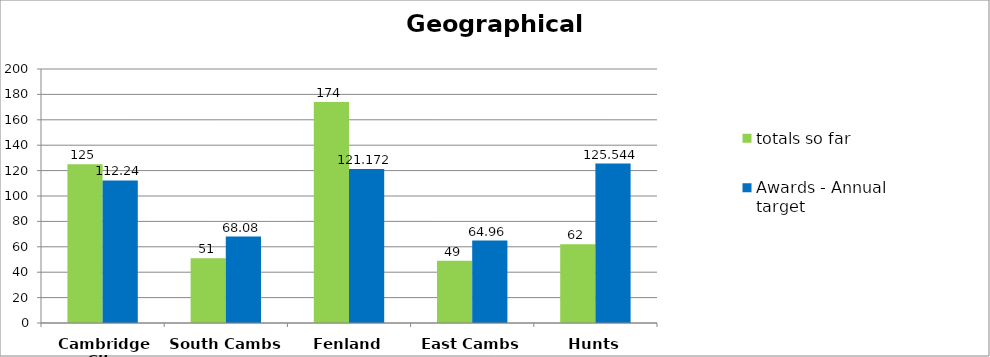
| Category | totals so far | Awards - Annual target  |
|---|---|---|
| Cambridge City | 125 | 112.24 |
| South Cambs | 51 | 68.08 |
| Fenland | 174 | 121.172 |
| East Cambs | 49 | 64.96 |
| Hunts | 62 | 125.544 |